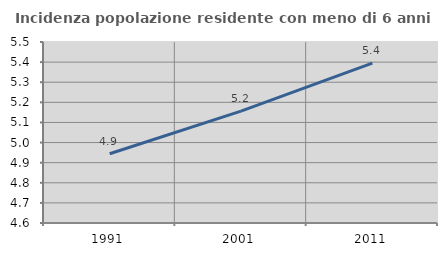
| Category | Incidenza popolazione residente con meno di 6 anni |
|---|---|
| 1991.0 | 4.944 |
| 2001.0 | 5.156 |
| 2011.0 | 5.395 |